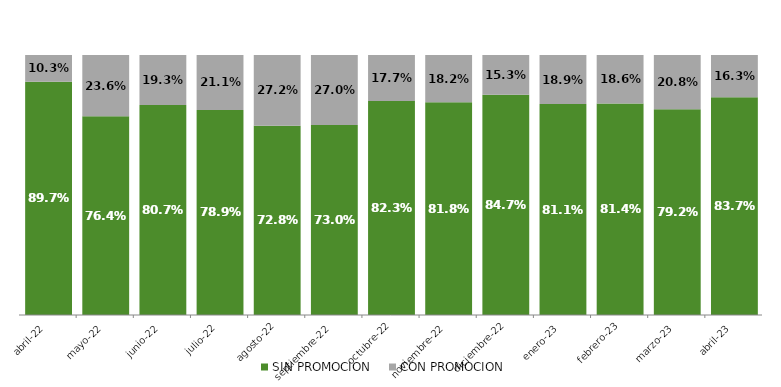
| Category | SIN PROMOCION   | CON PROMOCION   |
|---|---|---|
| 2022-04-01 | 0.897 | 0.103 |
| 2022-05-01 | 0.764 | 0.236 |
| 2022-06-01 | 0.807 | 0.193 |
| 2022-07-01 | 0.789 | 0.211 |
| 2022-08-01 | 0.728 | 0.272 |
| 2022-09-01 | 0.73 | 0.27 |
| 2022-10-01 | 0.823 | 0.177 |
| 2022-11-01 | 0.818 | 0.182 |
| 2022-12-01 | 0.847 | 0.153 |
| 2023-01-01 | 0.811 | 0.189 |
| 2023-02-01 | 0.814 | 0.186 |
| 2023-03-01 | 0.792 | 0.208 |
| 2023-04-01 | 0.837 | 0.163 |